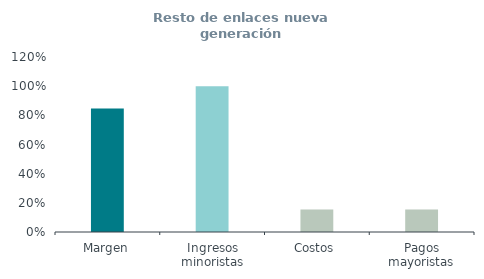
| Category | Resto de enlaces nueva generación
(% ingresos) |
|---|---|
| Margen | 0.846 |
| Ingresos minoristas | 1 |
| Costos | 0.154 |
| Pagos mayoristas | 0.154 |